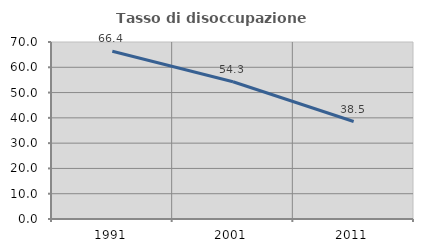
| Category | Tasso di disoccupazione giovanile  |
|---|---|
| 1991.0 | 66.354 |
| 2001.0 | 54.271 |
| 2011.0 | 38.543 |